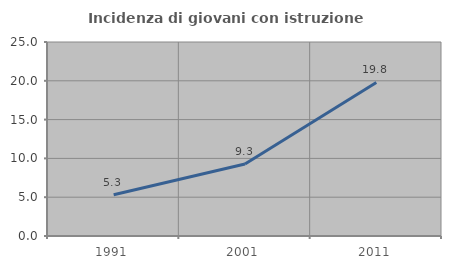
| Category | Incidenza di giovani con istruzione universitaria |
|---|---|
| 1991.0 | 5.305 |
| 2001.0 | 9.274 |
| 2011.0 | 19.783 |